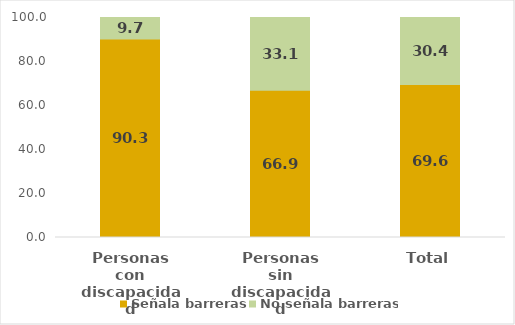
| Category | Señala barreras | No señala barreras |
|---|---|---|
| Personas con discapacidad | 90.253 | 9.747 |
| Personas sin discapacidad | 66.886 | 33.114 |
| Total | 69.561 | 30.439 |